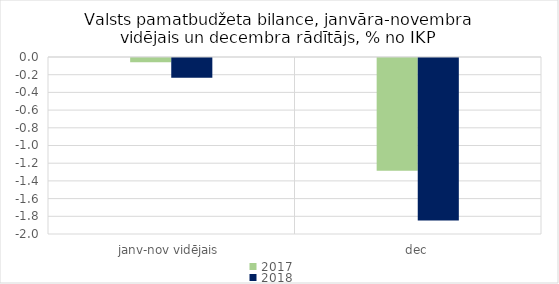
| Category | 2017 | 2018 |
|---|---|---|
| janv-nov vidējais | -0.047 | -0.222 |
| dec | -1.274 | -1.835 |